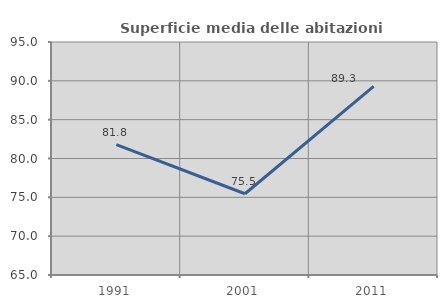
| Category | Superficie media delle abitazioni occupate |
|---|---|
| 1991.0 | 81.778 |
| 2001.0 | 75.462 |
| 2011.0 | 89.278 |